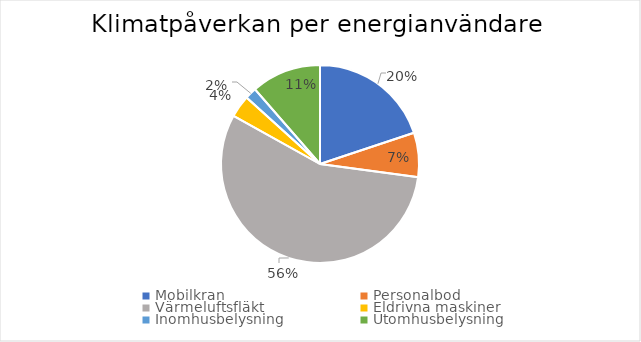
| Category | Series 0 |
|---|---|
| Mobilkran | 0.199 |
| Personalbod | 0.072 |
| Värmeluftsfläkt | 0.56 |
| Eldrivna maskiner | 0.036 |
| Inomhusbelysning | 0.019 |
| Utomhusbelysning | 0.114 |